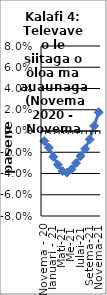
| Category | All items - 12 month rolling year average changes |
|---|---|
| Novema - 20 | -0.009 |
| Tesema - 20 | -0.016 |
| Ianuari - 21 | -0.024 |
| Fepuari -21 | -0.032 |
| Mati-21 | -0.038 |
| Aperila -21 | -0.039 |
| Me-21 | -0.036 |
| Iuni-21 | -0.03 |
| Iulai-21 | -0.024 |
| Aukuso-21 | -0.017 |
| Setema-21 | -0.008 |
| Oketopa-21 | 0.005 |
| Novema-21 | 0.018 |